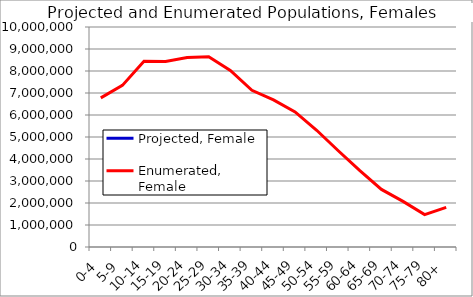
| Category | Projected, Female | Enumerated, Female |
|---|---|---|
| 0-4 |  | 6779172 |
| 5-9 |  | 7345231 |
| 10-14 |  | 8441348 |
| 15-19 |  | 8432002 |
| 20-24 |  | 8614963 |
| 25-29 |  | 8643418 |
| 30-34 |  | 8026855 |
| 35-39 |  | 7121916 |
| 40-44 |  | 6688797 |
| 45-49 |  | 6141338 |
| 50-54 |  | 5305407 |
| 55-59 |  | 4373875 |
| 60-64 |  | 3468085 |
| 65-69 |  | 2616745 |
| 70-74 |  | 2074264 |
| 75-79 |  | 1472930 |
| 80+ |  | 1802463 |